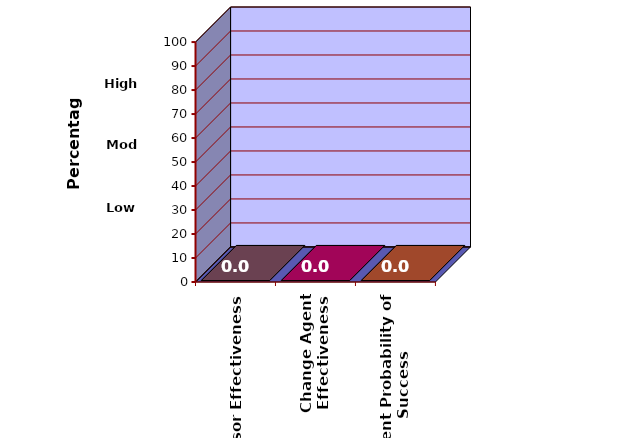
| Category | Series 0 |
|---|---|
| Sponsor Effectiveness | 0 |
| Change Agent Effectiveness | 0 |
| Current Probability of Success | 0 |